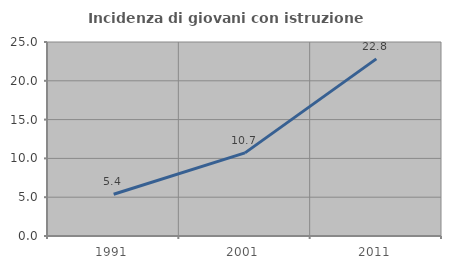
| Category | Incidenza di giovani con istruzione universitaria |
|---|---|
| 1991.0 | 5.376 |
| 2001.0 | 10.714 |
| 2011.0 | 22.826 |